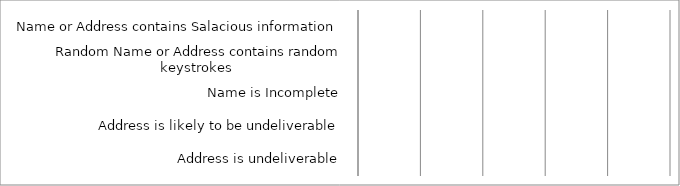
| Category | Series 0 |
|---|---|
|  Name or Address contains Salacious information  | 0 |
|  Random Name or Address contains random keystrokes  | 0 |
|  Name is Incomplete  | 0 |
|  Address is likely to be undeliverable  | 0 |
|  Address is undeliverable  | 0 |